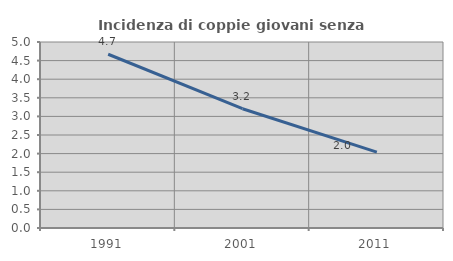
| Category | Incidenza di coppie giovani senza figli |
|---|---|
| 1991.0 | 4.67 |
| 2001.0 | 3.207 |
| 2011.0 | 2.041 |